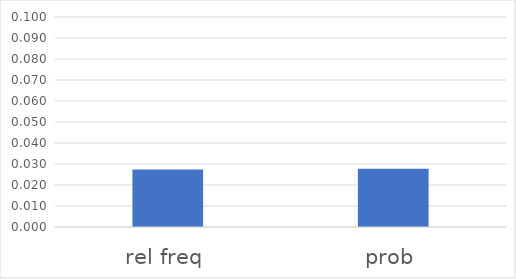
| Category | Series 0 |
|---|---|
| rel freq | 0.027 |
| prob | 0.028 |